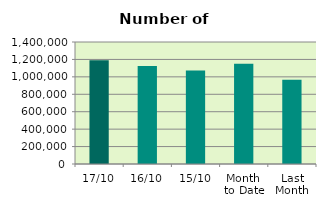
| Category | Series 0 |
|---|---|
| 17/10 | 1190260 |
| 16/10 | 1124690 |
| 15/10 | 1072944 |
| Month 
to Date | 1151740.769 |
| Last
Month | 967047.5 |